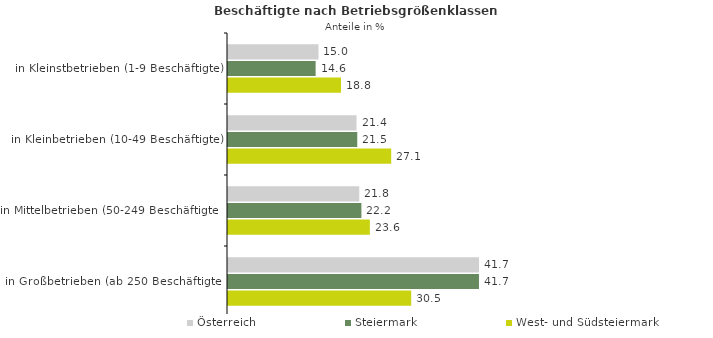
| Category | Österreich | Steiermark | West- und Südsteiermark |
|---|---|---|---|
| in Kleinstbetrieben (1-9 Beschäftigte) | 15.046 | 14.574 | 18.791 |
| in Kleinbetrieben (10-49 Beschäftigte) | 21.375 | 21.498 | 27.146 |
| in Mittelbetrieben (50-249 Beschäftigte) | 21.831 | 22.187 | 23.593 |
| in Großbetrieben (ab 250 Beschäftigte) | 41.748 | 41.742 | 30.47 |